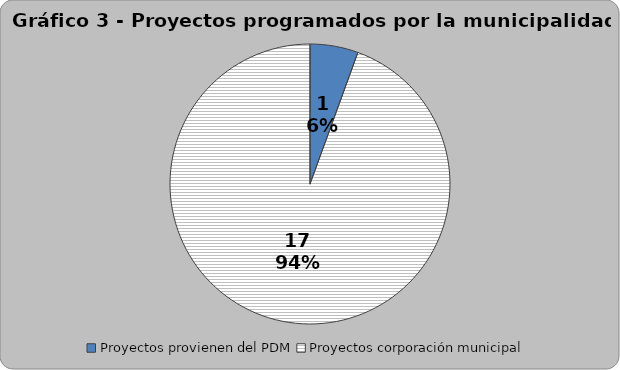
| Category | Series 0 |
|---|---|
| Proyectos provienen del PDM | 1 |
| Proyectos corporación municipal | 17 |